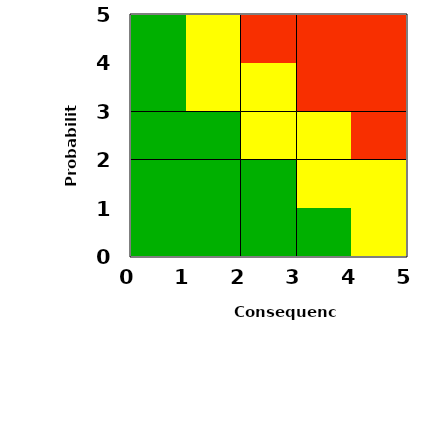
| Category | Series 0 |
|---|---|
| 2.3461538461538463 | 0 |